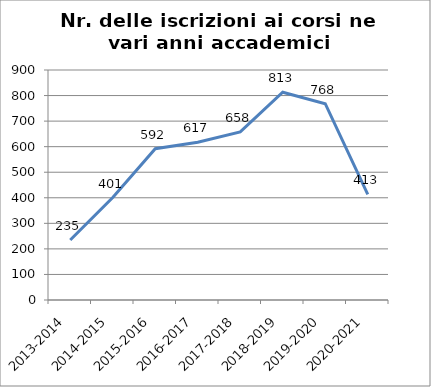
| Category | Nr. Iscrizioni ai Corsi |
|---|---|
| 2013-2014 | 235 |
| 2014-2015 | 401 |
| 2015-2016 | 592 |
| 2016-2017 | 617 |
| 2017-2018 | 658 |
| 2018-2019 | 813 |
| 2019-2020 | 768 |
| 2020-2021 | 413 |